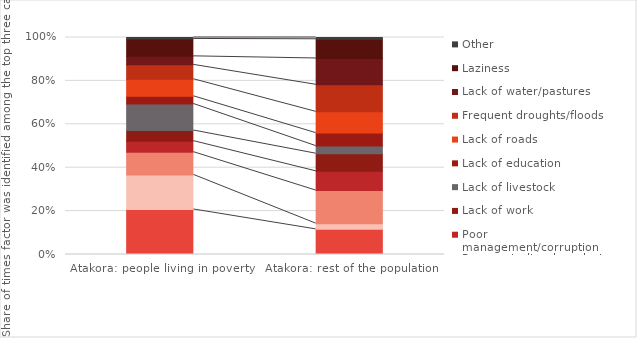
| Category | Lack of land | Cost of living | Poor agricultural product sales | Poor management/corruption | Lack of work | Lack of livestock | Lack of education | Lack of roads | Frequent droughts/floods | Lack of water/pastures | Laziness | Other |
|---|---|---|---|---|---|---|---|---|---|---|---|---|
| Atakora: people living in poverty | 0.597 | 0.458 | 0.301 | 0.146 | 0.141 | 0.352 | 0.102 | 0.226 | 0.191 | 0.113 | 0.231 | 0.019 |
| Atakora: rest of the population | 0.337 | 0.077 | 0.443 | 0.258 | 0.236 | 0.101 | 0.174 | 0.285 | 0.362 | 0.352 | 0.257 | 0.024 |